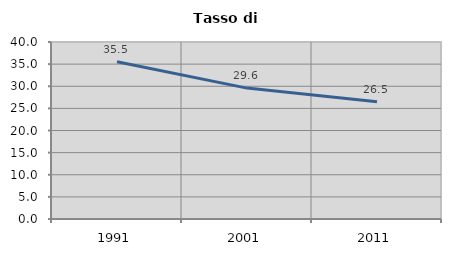
| Category | Tasso di disoccupazione   |
|---|---|
| 1991.0 | 35.535 |
| 2001.0 | 29.58 |
| 2011.0 | 26.501 |